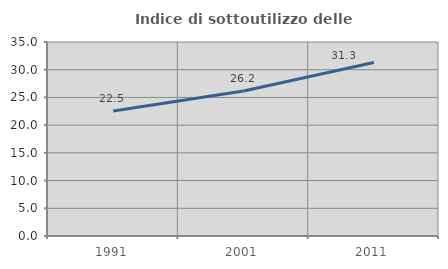
| Category | Indice di sottoutilizzo delle abitazioni  |
|---|---|
| 1991.0 | 22.547 |
| 2001.0 | 26.168 |
| 2011.0 | 31.302 |